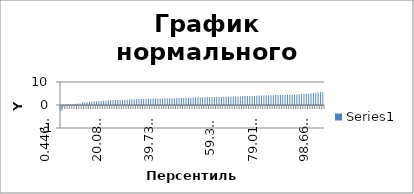
| Category | Series 0 |
|---|---|
| 0.44642857142857145 | -2.21 |
| 1.3392857142857144 | -0.09 |
| 2.232142857142857 | -0.05 |
| 3.1250000000000004 | 0.11 |
| 4.017857142857143 | 0.25 |
| 4.910714285714286 | 0.32 |
| 5.803571428571429 | 0.42 |
| 6.696428571428571 | 0.62 |
| 7.589285714285714 | 0.63 |
| 8.482142857142858 | 1.2 |
| 9.375 | 1.2 |
| 10.267857142857142 | 1.25 |
| 11.160714285714286 | 1.27 |
| 12.053571428571429 | 1.55 |
| 12.946428571428571 | 1.65 |
| 13.839285714285715 | 1.66 |
| 14.732142857142858 | 1.72 |
| 15.625 | 1.74 |
| 16.517857142857146 | 1.85 |
| 17.41071428571429 | 1.88 |
| 18.30357142857143 | 2.06 |
| 19.196428571428573 | 2.08 |
| 20.089285714285715 | 2.14 |
| 20.98214285714286 | 2.15 |
| 21.875000000000004 | 2.2 |
| 22.767857142857146 | 2.22 |
| 23.66071428571429 | 2.22 |
| 24.55357142857143 | 2.26 |
| 25.446428571428573 | 2.28 |
| 26.33928571428572 | 2.41 |
| 27.23214285714286 | 2.45 |
| 28.125000000000004 | 2.49 |
| 29.017857142857146 | 2.54 |
| 29.91071428571429 | 2.6 |
| 30.80357142857143 | 2.62 |
| 31.696428571428573 | 2.66 |
| 32.589285714285715 | 2.69 |
| 33.482142857142854 | 2.72 |
| 34.375 | 2.74 |
| 35.267857142857146 | 2.82 |
| 36.160714285714285 | 2.83 |
| 37.05357142857143 | 2.83 |
| 37.94642857142857 | 2.86 |
| 38.839285714285715 | 2.86 |
| 39.732142857142854 | 2.89 |
| 40.625 | 2.91 |
| 41.517857142857146 | 2.93 |
| 42.410714285714285 | 2.94 |
| 43.30357142857143 | 2.98 |
| 44.19642857142857 | 2.99 |
| 45.089285714285715 | 3.02 |
| 45.982142857142854 | 3.08 |
| 46.875 | 3.17 |
| 47.767857142857146 | 3.18 |
| 48.660714285714285 | 3.2 |
| 49.55357142857143 | 3.2 |
| 50.44642857142857 | 3.27 |
| 51.339285714285715 | 3.27 |
| 52.23214285714286 | 3.28 |
| 53.125 | 3.32 |
| 54.017857142857146 | 3.33 |
| 54.910714285714285 | 3.38 |
| 55.80357142857143 | 3.42 |
| 56.69642857142857 | 3.44 |
| 57.589285714285715 | 3.48 |
| 58.48214285714286 | 3.48 |
| 59.375 | 3.49 |
| 60.267857142857146 | 3.49 |
| 61.160714285714285 | 3.5 |
| 62.05357142857143 | 3.56 |
| 62.94642857142857 | 3.58 |
| 63.839285714285715 | 3.67 |
| 64.73214285714286 | 3.67 |
| 65.625 | 3.72 |
| 66.51785714285714 | 3.75 |
| 67.41071428571429 | 3.75 |
| 68.30357142857143 | 3.75 |
| 69.19642857142857 | 3.85 |
| 70.08928571428572 | 3.89 |
| 70.98214285714286 | 3.9 |
| 71.875 | 3.91 |
| 72.76785714285714 | 3.93 |
| 73.66071428571429 | 3.94 |
| 74.55357142857143 | 4.02 |
| 75.44642857142857 | 4.15 |
| 76.33928571428572 | 4.15 |
| 77.23214285714286 | 4.16 |
| 78.125 | 4.2 |
| 79.01785714285714 | 4.22 |
| 79.91071428571429 | 4.25 |
| 80.80357142857143 | 4.27 |
| 81.69642857142857 | 4.33 |
| 82.58928571428572 | 4.38 |
| 83.48214285714286 | 4.39 |
| 84.375 | 4.39 |
| 85.26785714285714 | 4.4 |
| 86.16071428571429 | 4.42 |
| 87.05357142857143 | 4.43 |
| 87.94642857142857 | 4.48 |
| 88.83928571428572 | 4.52 |
| 89.73214285714286 | 4.53 |
| 90.625 | 4.68 |
| 91.51785714285714 | 4.73 |
| 92.41071428571429 | 4.88 |
| 93.30357142857143 | 4.91 |
| 94.19642857142857 | 4.96 |
| 95.08928571428572 | 4.98 |
| 95.98214285714286 | 5.17 |
| 96.875 | 5.3 |
| 97.76785714285715 | 5.44 |
| 98.66071428571429 | 5.5 |
| 99.55357142857143 | 5.51 |